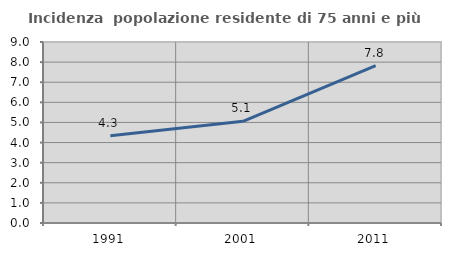
| Category | Incidenza  popolazione residente di 75 anni e più |
|---|---|
| 1991.0 | 4.333 |
| 2001.0 | 5.055 |
| 2011.0 | 7.822 |